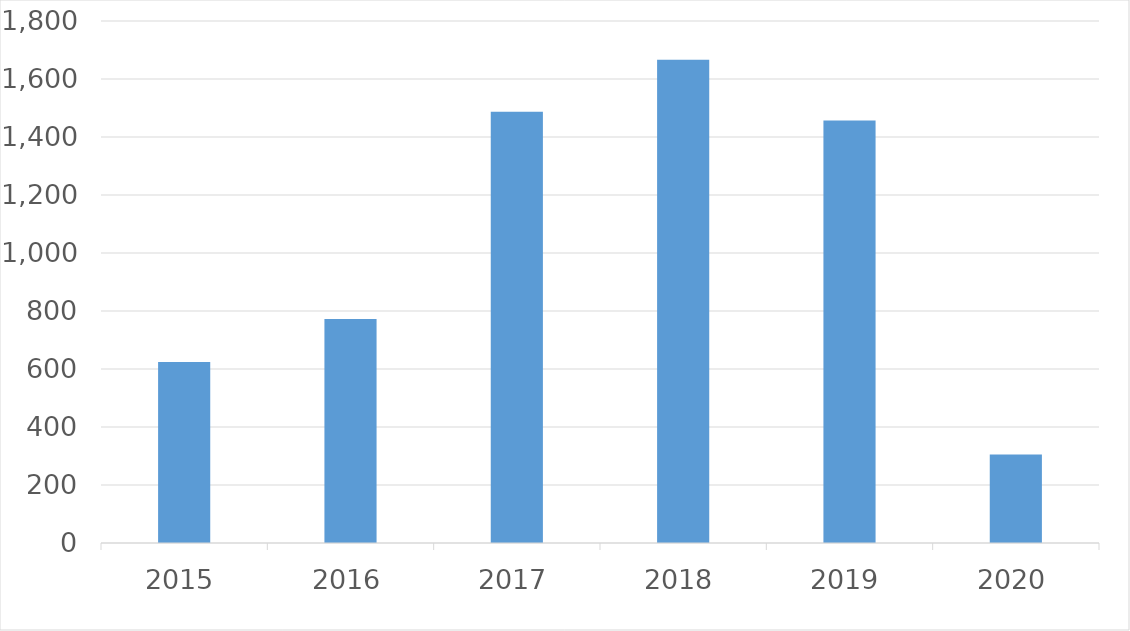
| Category | Series 0 |
|---|---|
| 2015 | 624 |
| 2016 | 772 |
| 2017 | 1487 |
| 2018 | 1666 |
| 2019 | 1457 |
| 2020 | 305 |